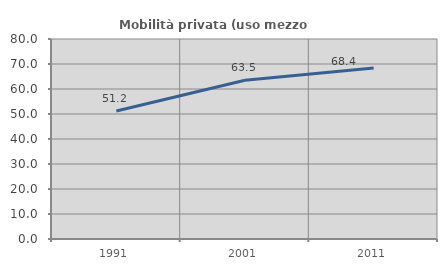
| Category | Mobilità privata (uso mezzo privato) |
|---|---|
| 1991.0 | 51.208 |
| 2001.0 | 63.514 |
| 2011.0 | 68.379 |